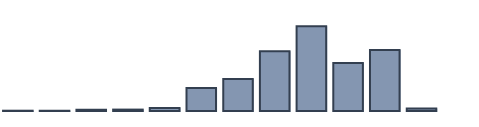
| Category | Series 0 |
|---|---|
| 0 | 0.094 |
| 1 | 0.09 |
| 2 | 0.397 |
| 3 | 0.443 |
| 4 | 0.949 |
| 5 | 7.279 |
| 6 | 10.054 |
| 7 | 18.822 |
| 8 | 26.693 |
| 9 | 15.136 |
| 10 | 19.262 |
| 11 | 0.781 |
| 12 | 0 |